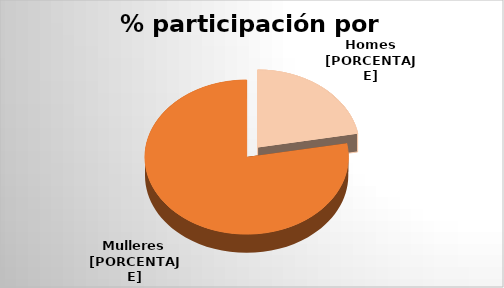
| Category | Total xeral |
|---|---|
| 0 | 25 |
| 1 | 88 |